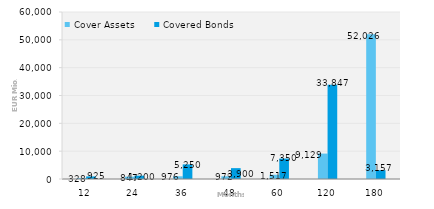
| Category | Cover Assets | Covered Bonds |
|---|---|---|
| 12.0 | 328.35 | 925 |
| 24.0 | 846.85 | 1200 |
| 36.0 | 975.78 | 5250 |
| 48.0 | 972.05 | 3900 |
| 60.0 | 1516.9 | 7350 |
| 120.0 | 9129.44 | 33847.2 |
| 180.0 | 52025.73 | 3157 |